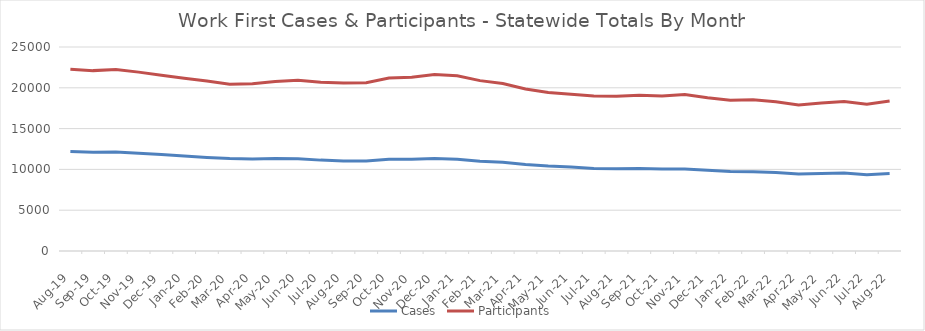
| Category | Cases | Participants |
|---|---|---|
| 2022-08-22 | 9505 | 18379 |
| 2022-07-22 | 9349 | 17973 |
| 2022-06-22 | 9561 | 18334 |
| 2022-05-22 | 9493 | 18139 |
| 2022-04-22 | 9434 | 17898 |
| 2022-03-22 | 9625 | 18293 |
| 2022-02-22 | 9713 | 18537 |
| 2022-01-22 | 9733 | 18484 |
| 2021-12-21 | 9885 | 18776 |
| 2021-11-21 | 10056 | 19192 |
| 2021-10-21 | 10034 | 19005 |
| 2021-09-21 | 10102 | 19085 |
| 2021-08-21 | 10090 | 18974 |
| 2021-07-21 | 10121 | 18988 |
| 2021-06-21 | 10298 | 19211 |
| 2021-05-21 | 10411 | 19413 |
| 2021-04-21 | 10601 | 19845 |
| 2021-03-21 | 10888 | 20521 |
| 2021-02-21 | 11007 | 20877 |
| 2021-01-21 | 11252 | 21466 |
| 2020-12-20 | 11350 | 21641 |
| 2020-11-20 | 11255 | 21305 |
| 2020-10-20 | 11243 | 21198 |
| 2020-09-20 | 11030 | 20626 |
| 2020-08-20 | 11034 | 20575 |
| 2020-07-20 | 11137 | 20693 |
| 2020-06-20 | 11320 | 20921 |
| 2020-05-20 | 11330 | 20766 |
| 2020-04-20 | 11263 | 20490 |
| 2020-03-20 | 11330 | 20431 |
| 2020-02-20 | 11473 | 20821 |
| 2020-01-20 | 11654 | 21174 |
| 2019-12-19 | 11822 | 21539 |
| 2019-11-19 | 11990 | 21921 |
| 2019-10-19 | 12136 | 22233 |
| 2019-09-19 | 12092 | 22105 |
| 2019-08-19 | 12206 | 22284 |